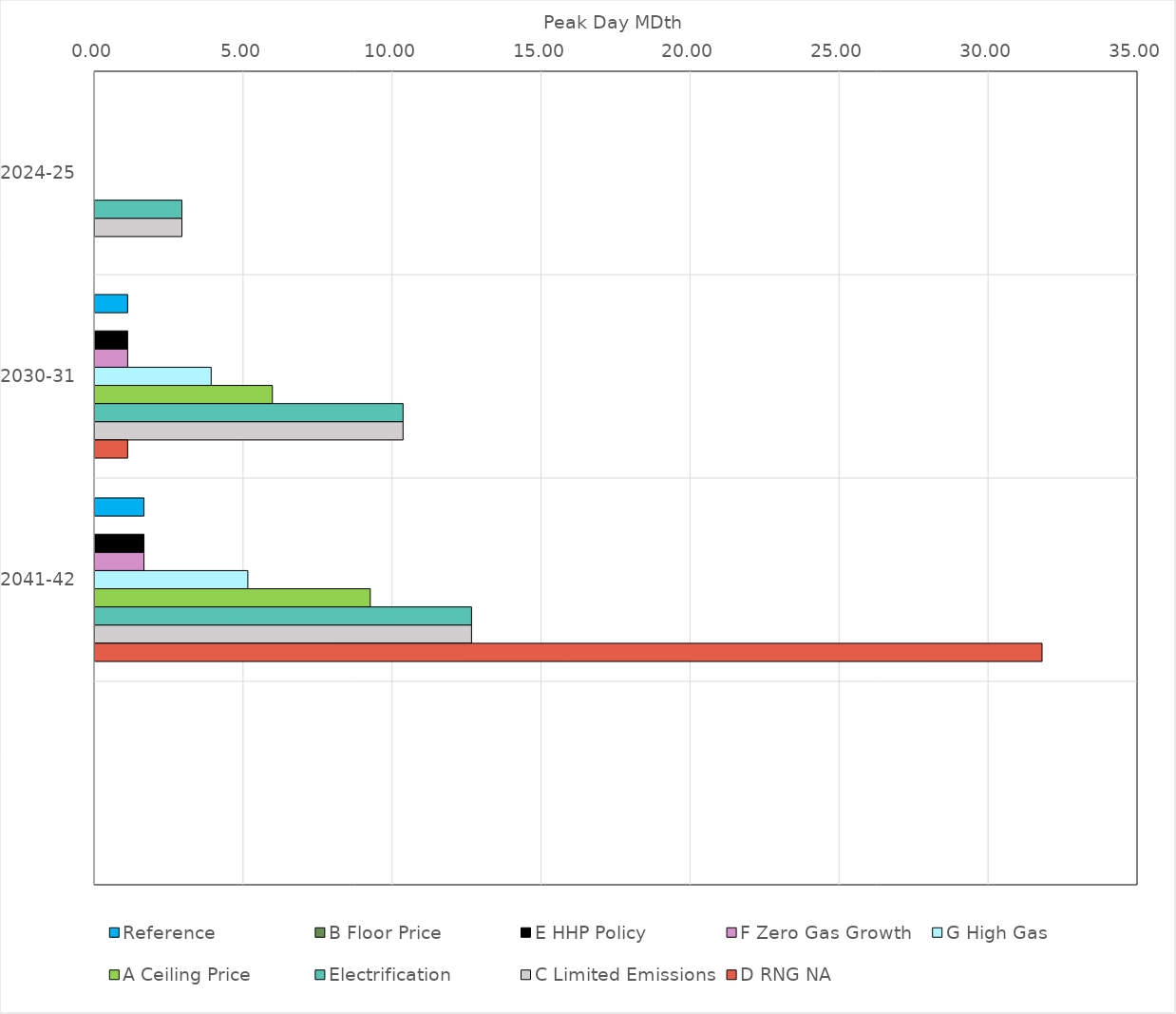
| Category | Reference | B Floor Price | E HHP Policy | F Zero Gas Growth | G High Gas | A Ceiling Price | Electrification | C Limited Emissions | D RNG NA |
|---|---|---|---|---|---|---|---|---|---|
| 2024-25 | 0 | 0 | 0 | 0 | 0 | 0 | 2.918 | 2.918 | 0 |
| 2030-31 | 1.096 | 0 | 1.096 | 1.096 | 3.899 | 5.953 | 10.337 | 10.337 | 1.096 |
| 2041-42 | 1.644 | 0 | 1.644 | 1.644 | 5.129 | 9.238 | 12.636 | 12.636 | 31.781 |